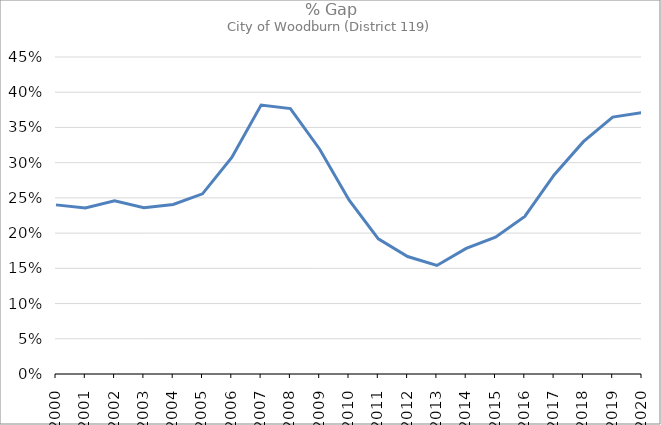
| Category | Series 0 |
|---|---|
| 2000.0 | 0.24 |
| 2001.0 | 0.236 |
| 2002.0 | 0.246 |
| 2003.0 | 0.236 |
| 2004.0 | 0.241 |
| 2005.0 | 0.256 |
| 2006.0 | 0.308 |
| 2007.0 | 0.382 |
| 2008.0 | 0.377 |
| 2009.0 | 0.319 |
| 2010.0 | 0.247 |
| 2011.0 | 0.192 |
| 2012.0 | 0.167 |
| 2013.0 | 0.154 |
| 2014.0 | 0.178 |
| 2015.0 | 0.194 |
| 2016.0 | 0.224 |
| 2017.0 | 0.283 |
| 2018.0 | 0.33 |
| 2019.0 | 0.365 |
| 2020.0 | 0.371 |